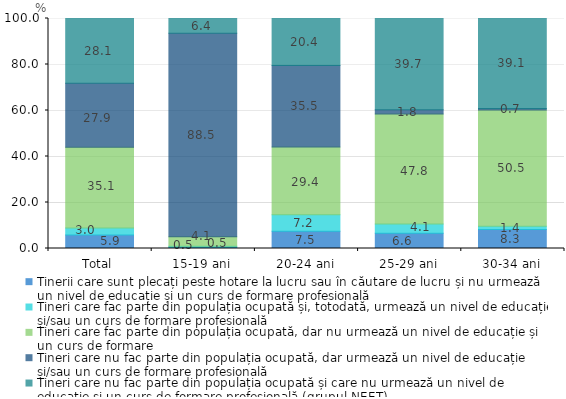
| Category | Tinerii care sunt plecați peste hotare la lucru sau în căutare de lucru și nu urmează un nivel de educație și un curs de formare profesională | Tineri care fac parte din populația ocupată și, totodată, urmează un nivel de educație și/sau un curs de formare profesională | Tineri care fac parte din populația ocupată, dar nu urmează un nivel de educație și un curs de formare | Tineri care nu fac parte din populația ocupată, dar urmează un nivel de educație și/sau un curs de formare profesională | Tineri care nu fac parte din populația ocupată și care nu urmează un nivel de educație și un curs de formare profesională (grupul NEET) |
|---|---|---|---|---|---|
| Total | 5.9 | 3 | 35.1 | 27.9 | 28.1 |
| 15-19 ani | 0.5 | 0.5 | 4.1 | 88.5 | 6.4 |
| 20-24 ani | 7.5 | 7.2 | 29.4 | 35.5 | 20.4 |
| 25-29 ani | 6.6 | 4.1 | 47.8 | 1.8 | 39.7 |
| 30-34 ani | 8.3 | 1.4 | 50.5 | 0.7 | 39.1 |